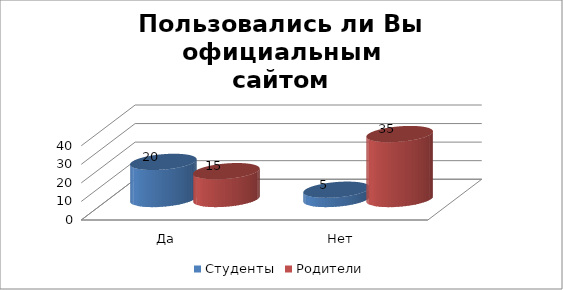
| Category | Студенты | Родители |
|---|---|---|
| Да | 20 | 15 |
| Нет | 5 | 35 |